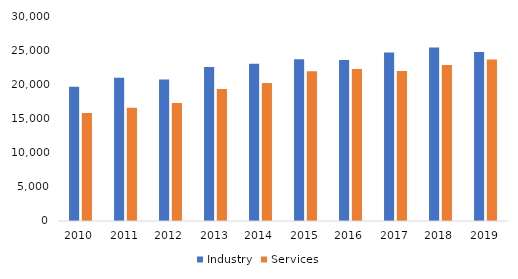
| Category | Industry | Services |
|---|---|---|
| 2010.0 | 19644 | 15804 |
| 2011.0 | 20971 | 16576 |
| 2012.0 | 20711 | 17251 |
| 2013.0 | 22529 | 19332 |
| 2014.0 | 23025 | 20205 |
| 2015.0 | 23685 | 21923 |
| 2016.0 | 23544 | 22241 |
| 2017.0 | 24674 | 21935 |
| 2018.0 | 25407 | 22819 |
| 2019.0 | 24731 | 23623 |